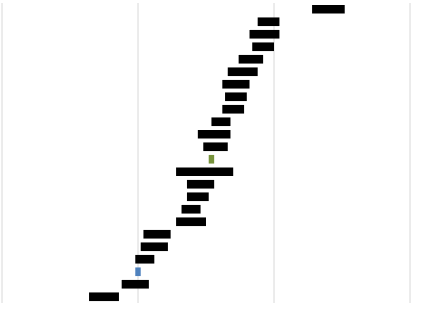
| Category | Series 0 | Series 1 | Series 2 | Series 3 | Series 4 | Series 5 |
|---|---|---|---|---|---|---|
| Country | 420 | 94 | 50 | 12 | 54 | 72 |